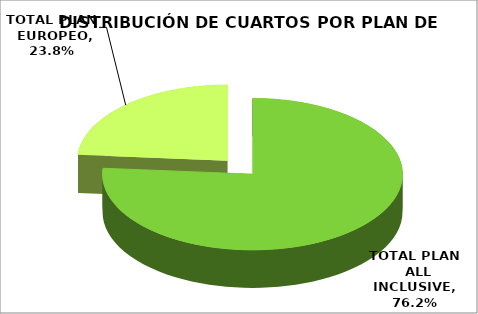
| Category | PLAN DE HOSPEDAJE |
|---|---|
| TOTAL PLAN  ALL INCLUSIVE | 0.762 |
| TOTAL PLAN  EUROPEO | 0.238 |